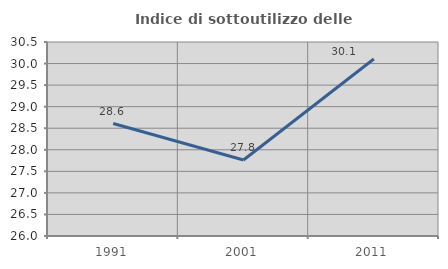
| Category | Indice di sottoutilizzo delle abitazioni  |
|---|---|
| 1991.0 | 28.608 |
| 2001.0 | 27.763 |
| 2011.0 | 30.107 |